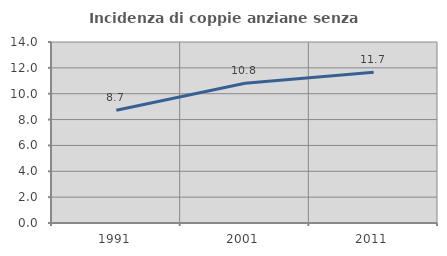
| Category | Incidenza di coppie anziane senza figli  |
|---|---|
| 1991.0 | 8.725 |
| 2001.0 | 10.81 |
| 2011.0 | 11.659 |